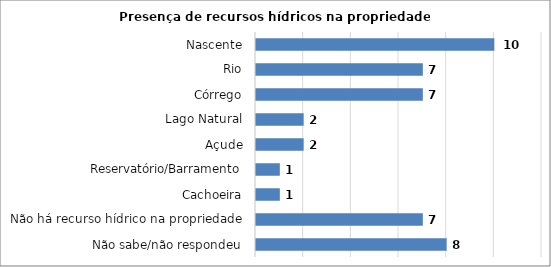
| Category | Series 0 |
|---|---|
| Não sabe/não respondeu | 8 |
| Não há recurso hídrico na propriedade | 7 |
| Cachoeira | 1 |
| Reservatório/Barramento | 1 |
| Açude | 2 |
| Lago Natural | 2 |
| Córrego | 7 |
| Rio | 7 |
| Nascente | 10 |